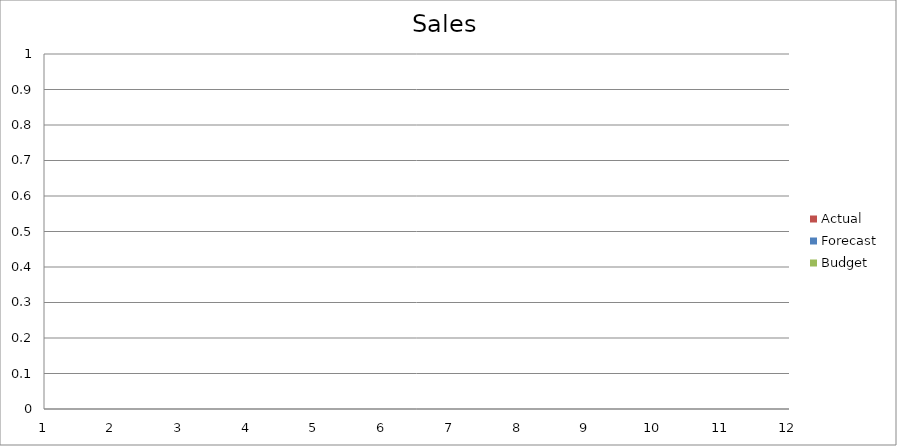
| Category | Budget | Forecast | Actual |
|---|---|---|---|
| 0 | 2750 | 1380 | 2220 |
| 1 | 2180 | 610 | 2280 |
| 2 | 790 | 2710 | 2010 |
| 3 | 1850 | 1570 | 750 |
| 4 | 2770 | 1910 | 2570 |
| 5 | 3320 | 2890 | 3340 |
| 6 | 2150 | 2580 | 3010 |
| 7 | 3380 | 1650 | 740 |
| 8 | 2760 | 2900 | 2820 |
| 9 | 3330 | 1460 | 860 |
| 10 | 1830 | 2530 | 2990 |
| 11 | 1570 | 1980 | 2540 |